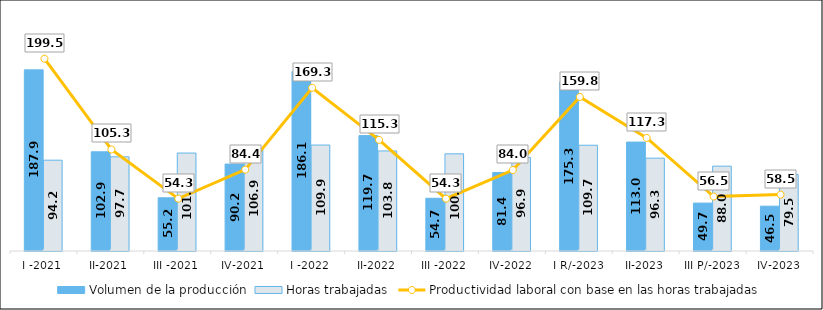
| Category | Volumen de la producción | Horas trabajadas |
|---|---|---|
| I -2021 | 187.9 | 94.2 |
| II-2021 | 102.9 | 97.7 |
| III -2021 | 55.2 | 101.6 |
| IV-2021 | 90.2 | 106.9 |
| I -2022 | 186.1 | 109.9 |
| II-2022 | 119.7 | 103.8 |
| III -2022 | 54.7 | 100.8 |
| IV-2022 | 81.4 | 96.9 |
| I R/-2023 | 175.3 | 109.7 |
| II-2023 | 113 | 96.3 |
| III P/-2023 | 49.7 | 88 |
| IV-2023 | 46.5 | 79.5 |